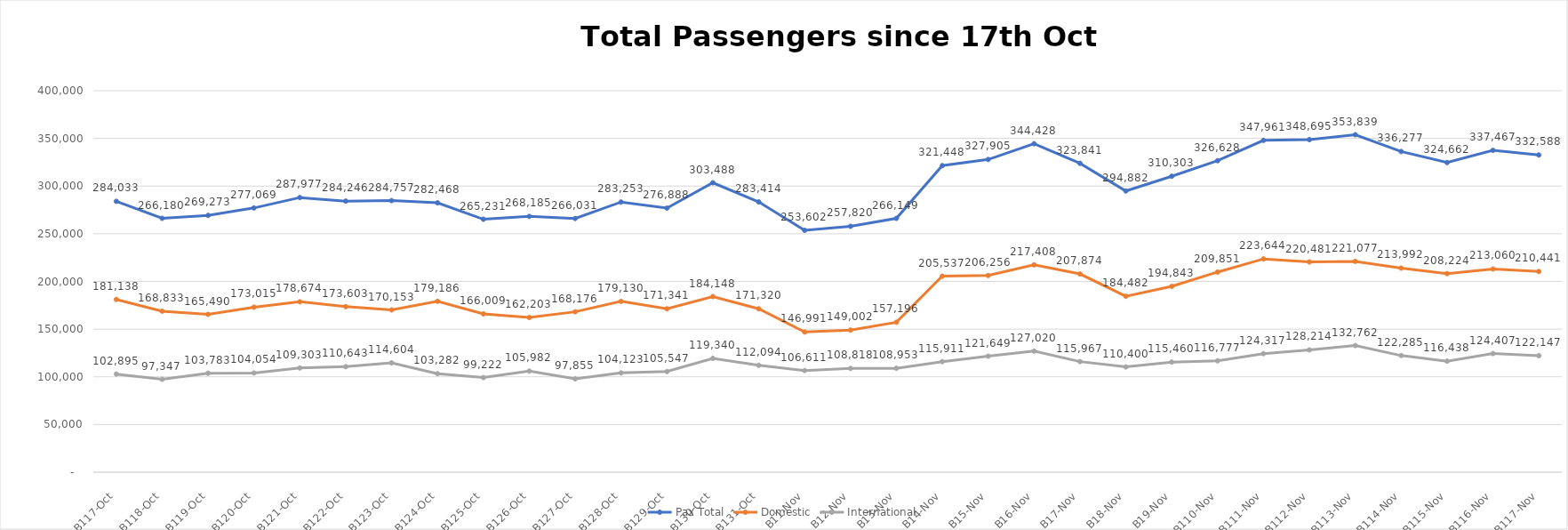
| Category | Pax Total |  Domestic  |  International  |
|---|---|---|---|
| 2022-10-17 | 284033 | 181138 | 102895 |
| 2022-10-18 | 266180 | 168833 | 97347 |
| 2022-10-19 | 269273 | 165490 | 103783 |
| 2022-10-20 | 277069 | 173015 | 104054 |
| 2022-10-21 | 287977 | 178674 | 109303 |
| 2022-10-22 | 284246 | 173603 | 110643 |
| 2022-10-23 | 284757 | 170153 | 114604 |
| 2022-10-24 | 282468 | 179186 | 103282 |
| 2022-10-25 | 265231 | 166009 | 99222 |
| 2022-10-26 | 268185 | 162203 | 105982 |
| 2022-10-27 | 266031 | 168176 | 97855 |
| 2022-10-28 | 283253 | 179130 | 104123 |
| 2022-10-29 | 276888 | 171341 | 105547 |
| 2022-10-30 | 303488 | 184148 | 119340 |
| 2022-10-31 | 283414 | 171320 | 112094 |
| 2022-11-01 | 253602 | 146991 | 106611 |
| 2022-11-02 | 257820 | 149002 | 108818 |
| 2022-11-03 | 266149 | 157196 | 108953 |
| 2022-11-04 | 321448 | 205537 | 115911 |
| 2022-11-05 | 327905 | 206256 | 121649 |
| 2022-11-06 | 344428 | 217408 | 127020 |
| 2022-11-07 | 323841 | 207874 | 115967 |
| 2022-11-08 | 294882 | 184482 | 110400 |
| 2022-11-09 | 310303 | 194843 | 115460 |
| 2022-11-10 | 326628 | 209851 | 116777 |
| 2022-11-11 | 347961 | 223644 | 124317 |
| 2022-11-12 | 348695 | 220481 | 128214 |
| 2022-11-13 | 353839 | 221077 | 132762 |
| 2022-11-14 | 336277 | 213992 | 122285 |
| 2022-11-15 | 324662 | 208224 | 116438 |
| 2022-11-16 | 337467 | 213060 | 124407 |
| 2022-11-17 | 332588 | 210441 | 122147 |